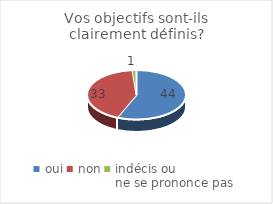
| Category | Vos objectifs sont-ils clairement définis? |
|---|---|
| oui | 44 |
| non | 33 |
| indécis ou 
ne se prononce pas | 1 |